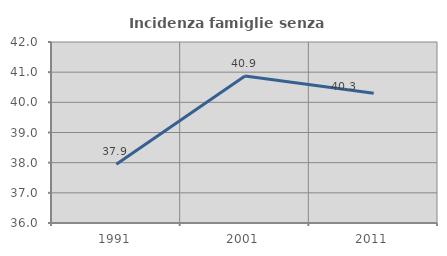
| Category | Incidenza famiglie senza nuclei |
|---|---|
| 1991.0 | 37.947 |
| 2001.0 | 40.87 |
| 2011.0 | 40.299 |